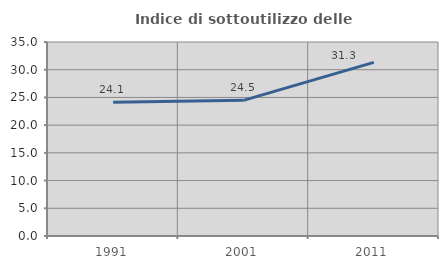
| Category | Indice di sottoutilizzo delle abitazioni  |
|---|---|
| 1991.0 | 24.138 |
| 2001.0 | 24.473 |
| 2011.0 | 31.33 |